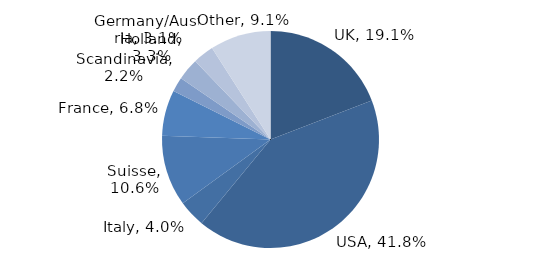
| Category | Investment Style |
|---|---|
| UK | 0.191 |
| USA | 0.418 |
| Italy | 0.04 |
| Suisse | 0.106 |
| France | 0.068 |
| Scandinavia | 0.022 |
| Holland | 0.033 |
| Germany/Austria | 0.031 |
| Other | 0.091 |